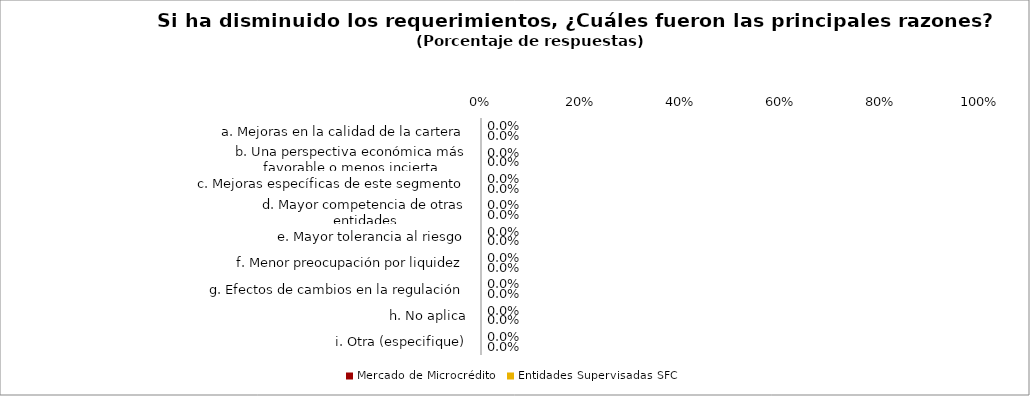
| Category | Mercado de Microcrédito | Entidades Supervisadas SFC |
|---|---|---|
| a. Mejoras en la calidad de la cartera | 0 | 0 |
| b. Una perspectiva económica más favorable o menos incierta | 0 | 0 |
| c. Mejoras específicas de este segmento | 0 | 0 |
| d. Mayor competencia de otras entidades | 0 | 0 |
| e. Mayor tolerancia al riesgo | 0 | 0 |
| f. Menor preocupación por liquidez | 0 | 0 |
| g. Efectos de cambios en la regulación | 0 | 0 |
| h. No aplica | 0 | 0 |
| i. Otra (especifique) | 0 | 0 |